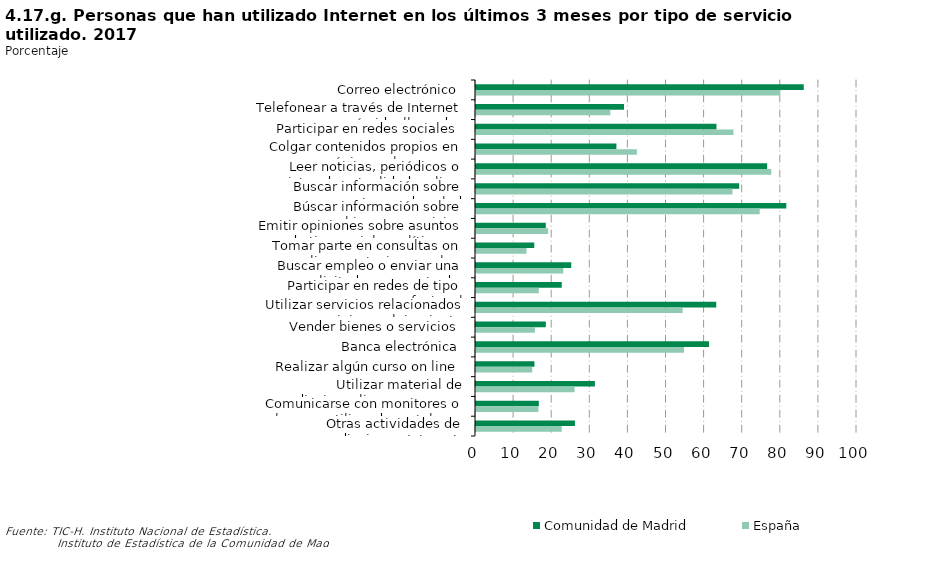
| Category | Comunidad de Madrid | España |
|---|---|---|
| Correo electrónico | 86.021 | 79.869 |
| Telefonear a través de Internet ó videollamadas | 38.849 | 35.254 |
| Participar en redes sociales | 63.11 | 67.575 |
| Colgar contenidos propios en una página web para ser compartidos | 36.853 | 42.224 |
| Leer noticias, periódicos o revistas de actualidad on line | 76.418 | 77.498 |
| Buscar información sobre temas de salud | 69.075 | 67.306 |
| Búscar información sobre bienes y servicios | 81.445 | 74.467 |
| Emitir opiniones sobre asuntos de tipo social o político en lugares de la Red | 18.326 | 18.932 |
| Tomar parte en consultas on line o votaciones sobre asuntos cívicos y políticos | 15.3 | 13.262 |
| Buscar empleo o enviar una solicitud a un puesto de trabajo | 24.998 | 22.908 |
| Participar en redes de tipo profesional | 22.502 | 16.479 |
| Utilizar servicios relacionados con viajes y alojamiento | 63.065 | 54.24 |
| Vender bienes o servicios | 18.329 | 15.462 |
| Banca electrónica | 61.154 | 54.581 |
| Realizar algún curso on line | 15.341 | 14.751 |
| Utilizar material de aprendizaje on line que no sea un curso completo on line | 31.207 | 25.872 |
| Comunicarse con monitores o alumnos utilizando portales o sitios web educativos | 16.487 | 16.376 |
| Otras actividades de aprendizaje por Internet | 25.968 | 22.494 |